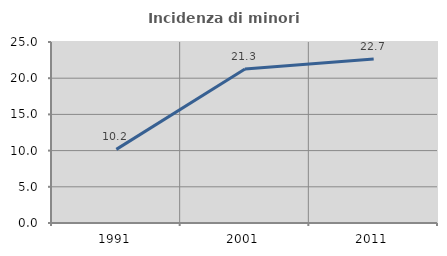
| Category | Incidenza di minori stranieri |
|---|---|
| 1991.0 | 10.169 |
| 2001.0 | 21.277 |
| 2011.0 | 22.667 |